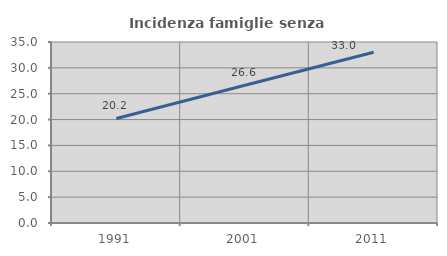
| Category | Incidenza famiglie senza nuclei |
|---|---|
| 1991.0 | 20.214 |
| 2001.0 | 26.645 |
| 2011.0 | 33.009 |